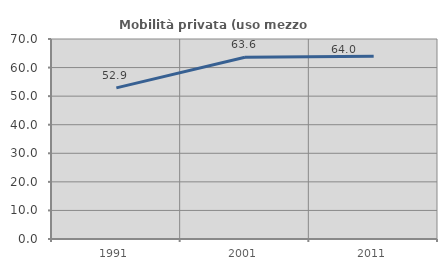
| Category | Mobilità privata (uso mezzo privato) |
|---|---|
| 1991.0 | 52.886 |
| 2001.0 | 63.619 |
| 2011.0 | 63.98 |